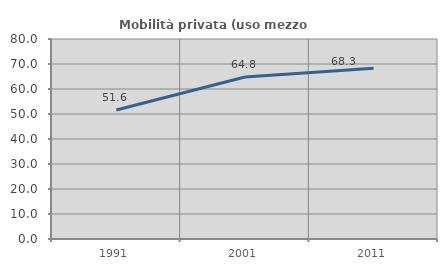
| Category | Mobilità privata (uso mezzo privato) |
|---|---|
| 1991.0 | 51.595 |
| 2001.0 | 64.774 |
| 2011.0 | 68.342 |